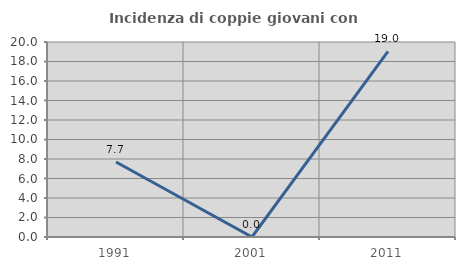
| Category | Incidenza di coppie giovani con figli |
|---|---|
| 1991.0 | 7.692 |
| 2001.0 | 0 |
| 2011.0 | 19.048 |